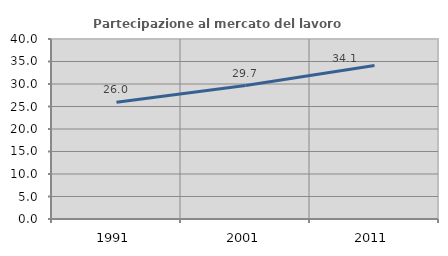
| Category | Partecipazione al mercato del lavoro  femminile |
|---|---|
| 1991.0 | 25.952 |
| 2001.0 | 29.652 |
| 2011.0 | 34.118 |